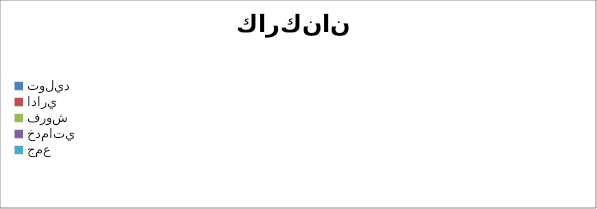
| Category | تعداد كاركنان  |
|---|---|
| توليد  | 0 |
| اداري  | 0 |
| فروش  | 0 |
| خدماتي  | 0 |
| جمع | 0 |